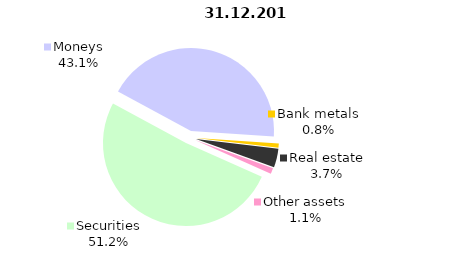
| Category | Total |
|---|---|
| Securities | 611.572 |
| Moneys | 515.18 |
| Bank metals | 10.05 |
| Real estate | 43.763 |
| Other assets | 13.415 |